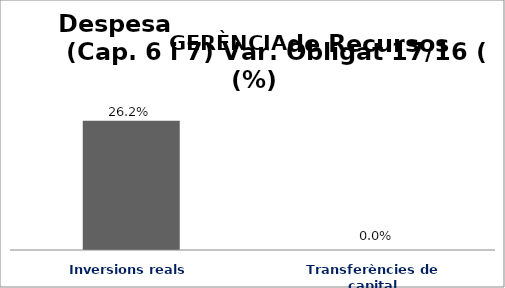
| Category | Series 0 |
|---|---|
| Inversions reals | 0.262 |
| Transferències de capital | 0 |